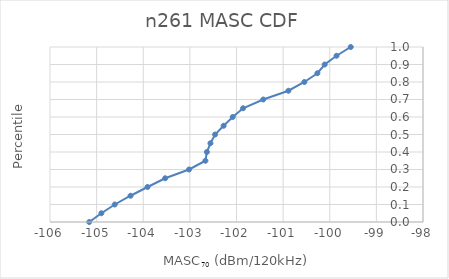
| Category | n261 |
|---|---|
| -105.159215780241 | 0 |
| -104.8980863120964 | 0.05 |
| -104.6112 | 0.1 |
| -104.2728 | 0.15 |
| -103.908 | 0.2 |
| -103.53 | 0.25 |
| -103.01784 | 0.3 |
| -102.6661 | 0.35 |
| -102.6352 | 0.4 |
| -102.55893999999999 | 0.45 |
| -102.46 | 0.5 |
| -102.27647230170466 | 0.55 |
| -102.08060751126068 | 0.6 |
| -101.86006853651942 | 0.65 |
| -101.4264133269634 | 0.7 |
| -100.8862 | 0.75 |
| -100.54456 | 0.8 |
| -100.26476 | 0.85 |
| -100.10864000000001 | 0.9 |
| -99.85396 | 0.95 |
| -99.55 | 1 |